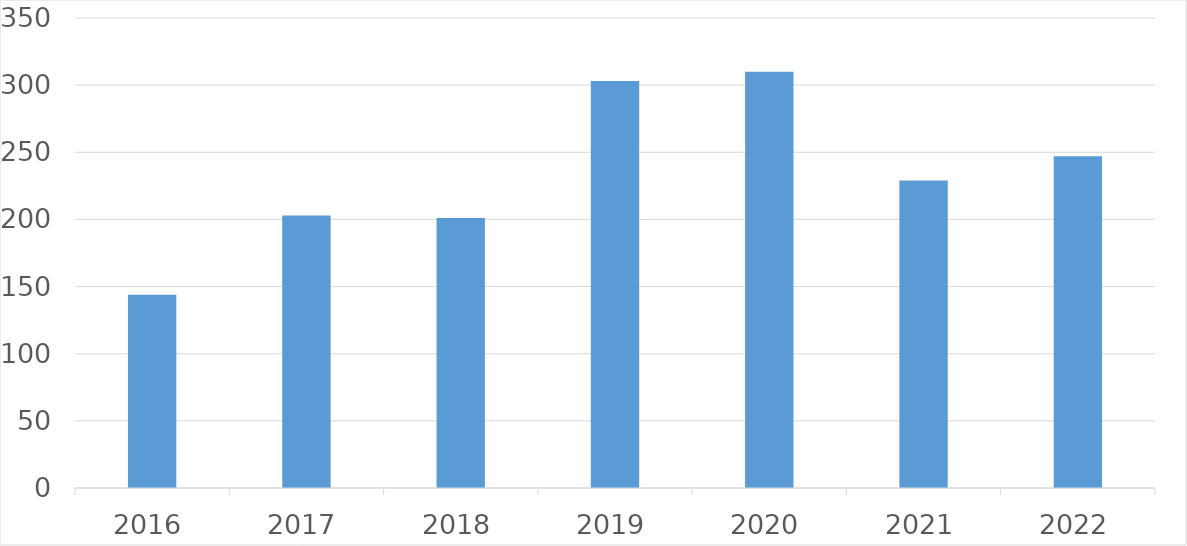
| Category | Series 0 |
|---|---|
| 2016 | 144 |
| 2017 | 203 |
| 2018 | 201 |
| 2019 | 303 |
| 2020 | 310 |
| 2021 | 229 |
| 2022 | 247 |